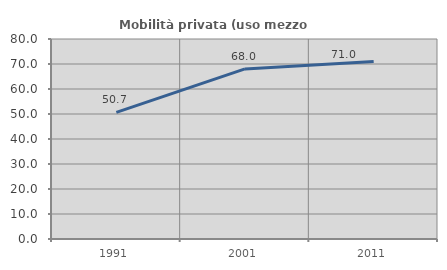
| Category | Mobilità privata (uso mezzo privato) |
|---|---|
| 1991.0 | 50.665 |
| 2001.0 | 68.04 |
| 2011.0 | 70.958 |